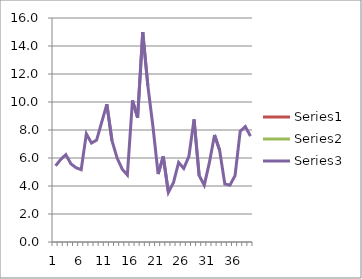
| Category | Series 1 | Series 2 | Series 3 | Series 0 |
|---|---|---|---|---|
| 0 |  |  | 5.443 |  |
| 1 |  |  | 5.893 |  |
| 2 |  |  | 6.239 |  |
| 3 |  |  | 5.581 |  |
| 4 |  |  | 5.304 |  |
| 5 |  |  | 5.166 |  |
| 6 |  |  | 7.727 |  |
| 7 |  |  | 7.07 |  |
| 8 |  |  | 7.277 |  |
| 9 |  |  | 8.558 |  |
| 10 |  |  | 9.839 |  |
| 11 |  |  | 7.243 |  |
| 12 |  |  | 5.997 |  |
| 13 |  |  | 5.201 |  |
| 14 |  |  | 4.785 |  |
| 15 |  |  | 10.116 |  |
| 16 |  |  | 8.87 |  |
| 17 |  |  | 14.996 |  |
| 18 |  |  | 11.154 |  |
| 19 |  |  | 8.212 |  |
| 20 |  |  | 4.856 |  |
| 21 |  |  | 6.111 |  |
| 22 |  |  | 3.54 |  |
| 23 |  |  | 4.258 |  |
| 24 |  |  | 5.684 |  |
| 25 |  |  | 5.257 |  |
| 26 |  |  | 6.111 |  |
| 27 |  |  | 8.76 |  |
| 28 |  |  | 4.745 |  |
| 29 |  |  | 4.061 |  |
| 30 |  |  | 5.684 |  |
| 31 |  |  | 7.649 |  |
| 32 |  |  | 6.539 |  |
| 33 |  |  | 4.147 |  |
| 34 |  |  | 4.061 |  |
| 35 |  |  | 4.745 |  |
| 36 |  |  | 7.906 |  |
| 37 |  |  | 8.247 |  |
| 38 |  |  | 7.564 |  |